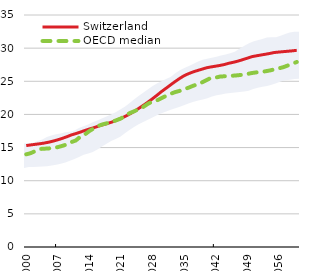
| Category | Switzerland | OECD median |
|---|---|---|
| 0 | 15.297 | 13.98 |
| 1900-01-01 | 15.401 | 14.16 |
| 1900-01-02 | 15.489 | 14.479 |
| 1900-01-03 | 15.577 | 14.789 |
| 1900-01-04 | 15.682 | 14.828 |
| 1900-01-05 | 15.814 | 14.873 |
| 1900-01-06 | 15.982 | 14.956 |
| 1900-01-07 | 16.173 | 15.067 |
| 1900-01-08 | 16.391 | 15.258 |
| 1900-01-09 | 16.634 | 15.464 |
| 1900-01-10 | 16.904 | 15.825 |
| 1900-01-11 | 17.109 | 16.073 |
| 1900-01-12 | 17.336 | 16.646 |
| 1900-01-13 | 17.575 | 16.973 |
| 1900-01-14 | 17.801 | 17.497 |
| 1900-01-15 | 17.997 | 17.904 |
| 1900-01-16 | 18.231 | 18.278 |
| 1900-01-17 | 18.436 | 18.515 |
| 1900-01-18 | 18.632 | 18.683 |
| 1900-01-19 | 18.85 | 18.875 |
| 1900-01-20 | 19.114 | 19.123 |
| 1900-01-21 | 19.403 | 19.39 |
| 1900-01-22 | 19.724 | 19.79 |
| 1900-01-23 | 20.081 | 20.219 |
| 1900-01-24 | 20.482 | 20.492 |
| 1900-01-25 | 20.931 | 20.804 |
| 1900-01-26 | 21.379 | 21.149 |
| 1900-01-27 | 21.858 | 21.613 |
| 1900-01-28 | 22.366 | 21.951 |
| 1900-01-29 | 22.897 | 22.125 |
| 1900-01-30 | 23.447 | 22.455 |
| 1900-01-31 | 23.945 | 22.795 |
| 1900-02-01 | 24.45 | 23.1 |
| 1900-02-02 | 24.948 | 23.365 |
| 1900-02-03 | 25.414 | 23.547 |
| 1900-02-04 | 25.838 | 23.79 |
| 1900-02-05 | 26.149 | 24.034 |
| 1900-02-06 | 26.408 | 24.317 |
| 1900-02-07 | 26.629 | 24.545 |
| 1900-02-08 | 26.833 | 24.843 |
| 1900-02-09 | 27.038 | 25.182 |
| 1900-02-10 | 27.168 | 25.533 |
| 1900-02-11 | 27.281 | 25.558 |
| 1900-02-12 | 27.395 | 25.714 |
| 1900-02-13 | 27.539 | 25.756 |
| 1900-02-14 | 27.732 | 25.793 |
| 1900-02-15 | 27.875 | 25.853 |
| 1900-02-16 | 28.052 | 25.911 |
| 1900-02-17 | 28.259 | 25.989 |
| 1900-02-18 | 28.481 | 26.097 |
| 1900-02-19 | 28.708 | 26.241 |
| 1900-02-20 | 28.837 | 26.339 |
| 1900-02-21 | 28.957 | 26.419 |
| 1900-02-22 | 29.073 | 26.5 |
| 1900-02-23 | 29.196 | 26.63 |
| 1900-02-24 | 29.339 | 26.787 |
| 1900-02-25 | 29.408 | 26.949 |
| 1900-02-26 | 29.47 | 27.122 |
| 1900-02-27 | 29.529 | 27.377 |
| 1900-02-28 | 29.593 | 27.64 |
| 1900-02-28 | 29.672 | 27.91 |